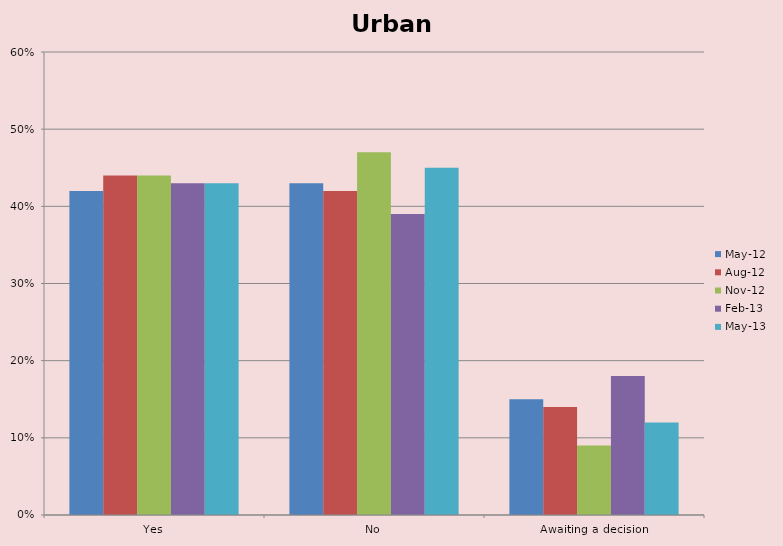
| Category | May-12 | Aug-12 | Nov-12 | Feb-13 | May-13 |
|---|---|---|---|---|---|
| Yes | 0.42 | 0.44 | 0.44 | 0.43 | 0.43 |
| No | 0.43 | 0.42 | 0.47 | 0.39 | 0.45 |
| Awaiting a decision | 0.15 | 0.14 | 0.09 | 0.18 | 0.12 |